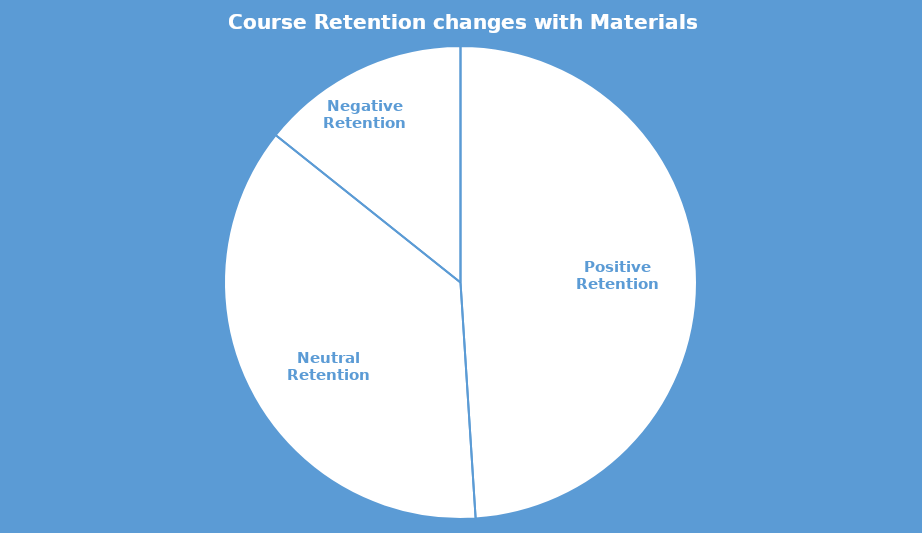
| Category | Series 0 |
|---|---|
| Positive Retention | 0.49 |
| Neutral Retention | 0.367 |
| Negative Retention | 0.143 |